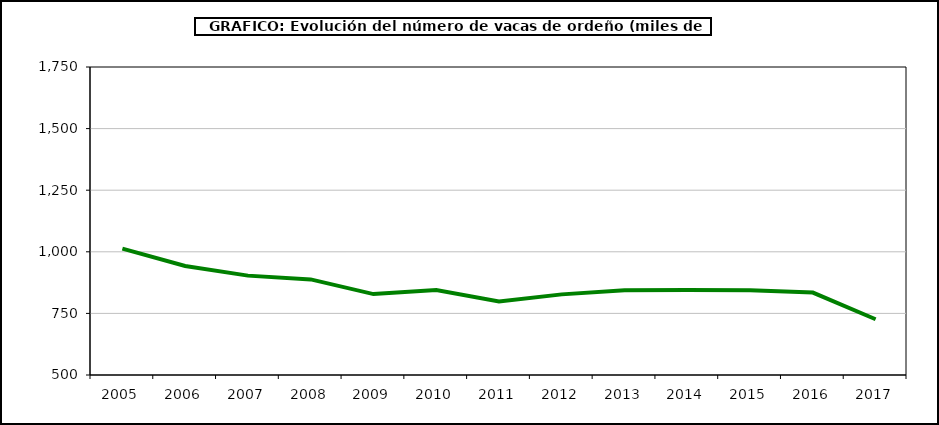
| Category | Leche de vaca |
|---|---|
| 2005.0 | 1012.914 |
| 2006.0 | 942.344 |
| 2007.0 | 903.287 |
| 2008.0 | 888 |
| 2009.0 | 828.347 |
| 2010.0 | 845 |
| 2011.0 | 798 |
| 2012.0 | 827.207 |
| 2013.0 | 844.06 |
| 2014.0 | 844.79 |
| 2015.0 | 844.114 |
| 2016.0 | 834.453 |
| 2017.0 | 726.131 |